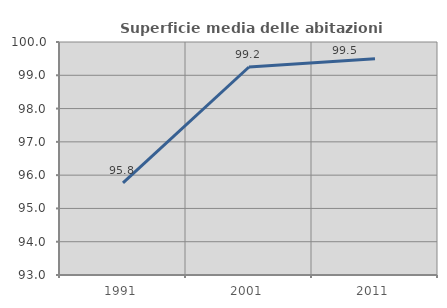
| Category | Superficie media delle abitazioni occupate |
|---|---|
| 1991.0 | 95.77 |
| 2001.0 | 99.249 |
| 2011.0 | 99.496 |